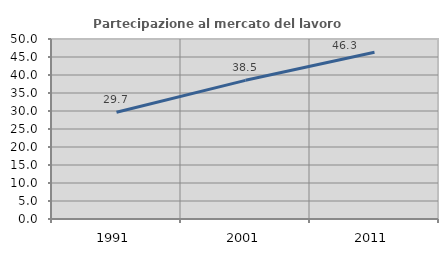
| Category | Partecipazione al mercato del lavoro  femminile |
|---|---|
| 1991.0 | 29.655 |
| 2001.0 | 38.519 |
| 2011.0 | 46.324 |